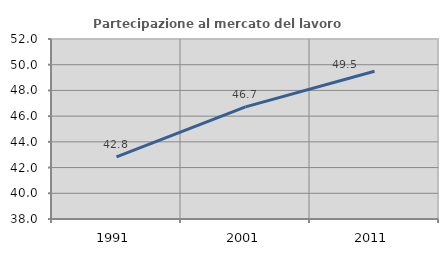
| Category | Partecipazione al mercato del lavoro  femminile |
|---|---|
| 1991.0 | 42.825 |
| 2001.0 | 46.718 |
| 2011.0 | 49.496 |